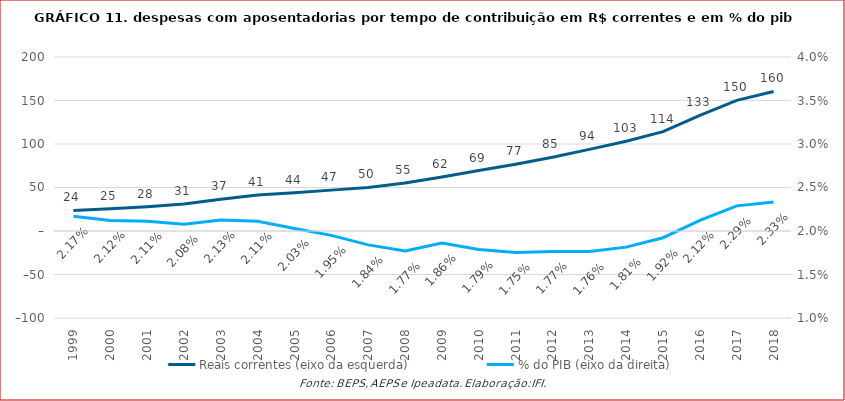
| Category | Reais correntes (eixo da esquerda) |
|---|---|
| 1999 | 23593619782.38 |
| 2000 | 25440391863.823 |
| 2001 | 27789792310.987 |
| 2002 | 30943417031.51 |
| 2003 | 36518265065 |
| 2004 | 41343205056 |
| 2005 | 44051039979 |
| 2006 | 46986089403.44 |
| 2007 | 50072110100.08 |
| 2008 | 55095732287.74 |
| 2009 | 62032147928.85 |
| 2010 | 69450363245.13 |
| 2011 | 76723497914.67 |
| 2012 | 84848866421.09 |
| 2013 | 93796357661.82 |
| 2014 | 103206287169.27 |
| 2015 | 114141615000 |
| 2016 | 133023774000 |
| 2017 | 150203870000 |
| 2018 | 160355192934.109 |